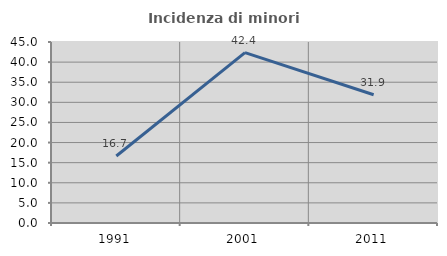
| Category | Incidenza di minori stranieri |
|---|---|
| 1991.0 | 16.667 |
| 2001.0 | 42.373 |
| 2011.0 | 31.892 |